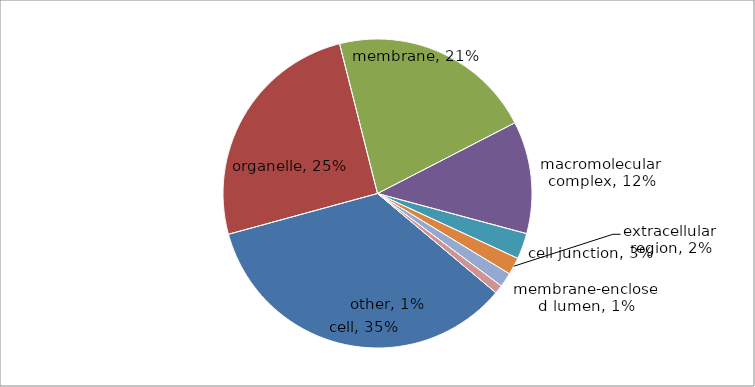
| Category | Series 0 |
|---|---|
| cell | 115 |
| organelle | 84 |
| membrane | 71 |
| macromolecular complex | 39 |
| cell junction | 9 |
| extracellular region | 6 |
| membrane-enclosed lumen | 5 |
| other | 3 |